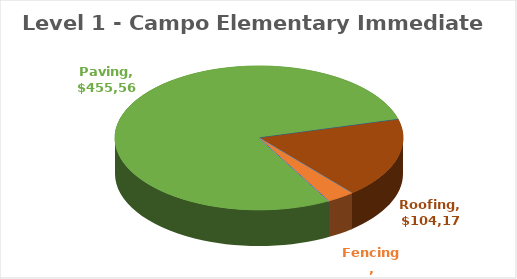
| Category | Series 0 |
|---|---|
| Electrical | 0 |
| Fencing | 17820 |
| Finishes | 0 |
| HVAC | 0 |
| LowVoltage | 0 |
| Paving | 455565 |
| Plumbing | 0 |
| Roofing | 104171 |
| Playground | 0 |